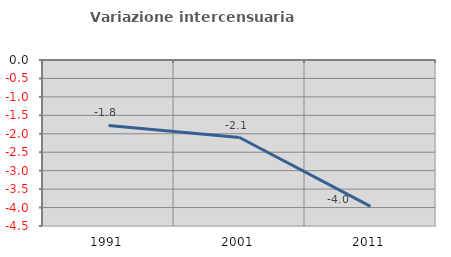
| Category | Variazione intercensuaria annua |
|---|---|
| 1991.0 | -1.775 |
| 2001.0 | -2.102 |
| 2011.0 | -3.966 |